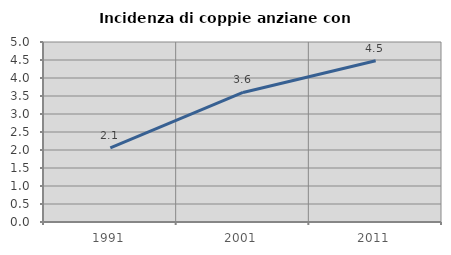
| Category | Incidenza di coppie anziane con figli |
|---|---|
| 1991.0 | 2.061 |
| 2001.0 | 3.598 |
| 2011.0 | 4.481 |